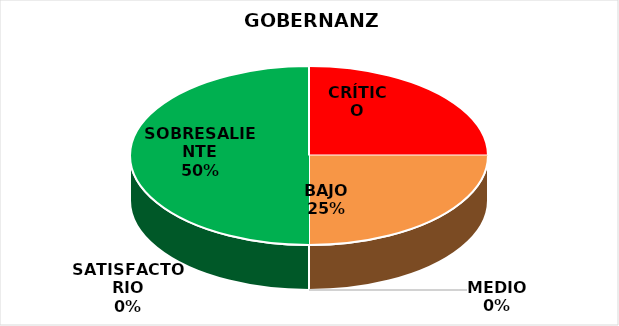
| Category | Series 1 | Series 0 |
|---|---|---|
| CRÍTICO | 1 | 5 |
| BAJO | 1 | 0 |
| MEDIO | 0 | 0 |
| SATISFACTORIO | 0 | 0 |
| SOBRESALIENTE | 2 | 6 |